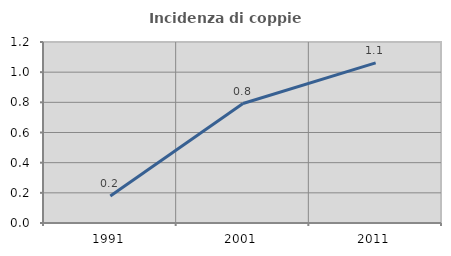
| Category | Incidenza di coppie miste |
|---|---|
| 1991.0 | 0.179 |
| 2001.0 | 0.792 |
| 2011.0 | 1.062 |